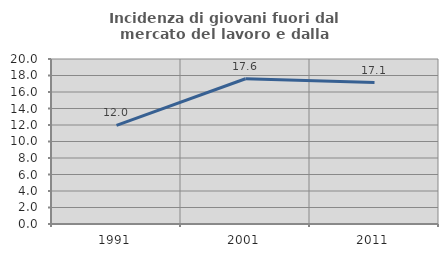
| Category | Incidenza di giovani fuori dal mercato del lavoro e dalla formazione  |
|---|---|
| 1991.0 | 11.957 |
| 2001.0 | 17.608 |
| 2011.0 | 17.143 |